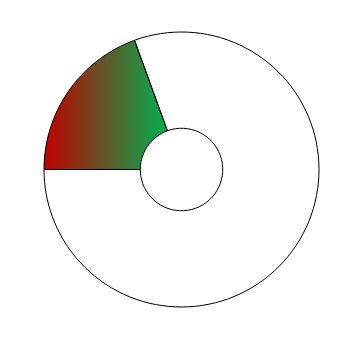
| Category | Series 0 |
|---|---|
| 0 | 70 |
| 1 | 290 |